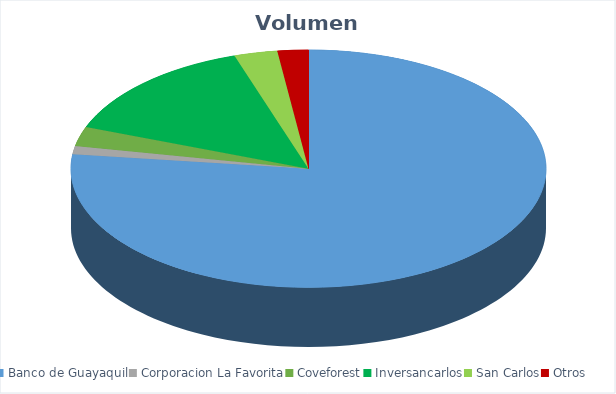
| Category | VOLUMEN ($USD) |
|---|---|
| Banco de Guayaquil | 144000 |
| Corporacion La Favorita | 2054.4 |
| Coveforest | 5002.4 |
| Inversancarlos | 26667 |
| San Carlos | 5490 |
| Otros | 3929.8 |